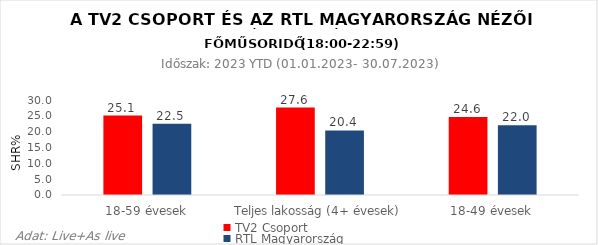
| Category | TV2 Csoport | RTL Magyarország |
|---|---|---|
| 18-59 évesek | 25.1 | 22.5 |
| Teljes lakosság (4+ évesek) | 27.6 | 20.4 |
| 18-49 évesek | 24.6 | 22 |